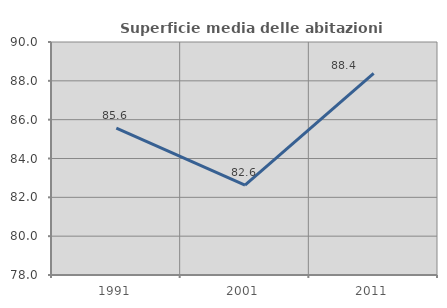
| Category | Superficie media delle abitazioni occupate |
|---|---|
| 1991.0 | 85.563 |
| 2001.0 | 82.625 |
| 2011.0 | 88.386 |